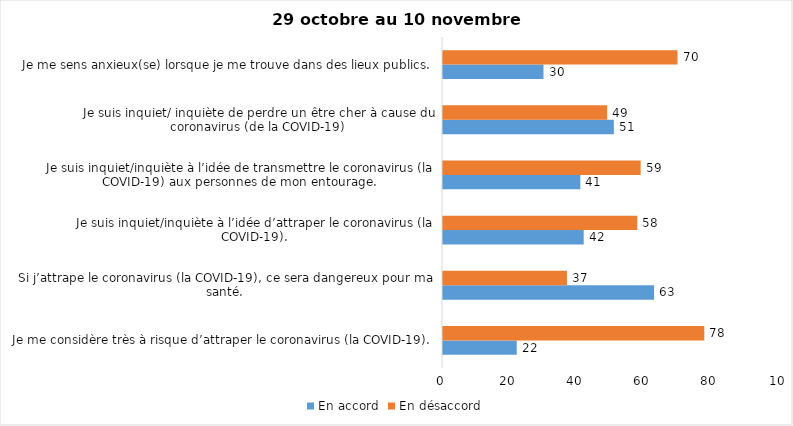
| Category | En accord | En désaccord |
|---|---|---|
| Je me considère très à risque d’attraper le coronavirus (la COVID-19). | 22 | 78 |
| Si j’attrape le coronavirus (la COVID-19), ce sera dangereux pour ma santé. | 63 | 37 |
| Je suis inquiet/inquiète à l’idée d’attraper le coronavirus (la COVID-19). | 42 | 58 |
| Je suis inquiet/inquiète à l’idée de transmettre le coronavirus (la COVID-19) aux personnes de mon entourage. | 41 | 59 |
| Je suis inquiet/ inquiète de perdre un être cher à cause du coronavirus (de la COVID-19) | 51 | 49 |
| Je me sens anxieux(se) lorsque je me trouve dans des lieux publics. | 30 | 70 |